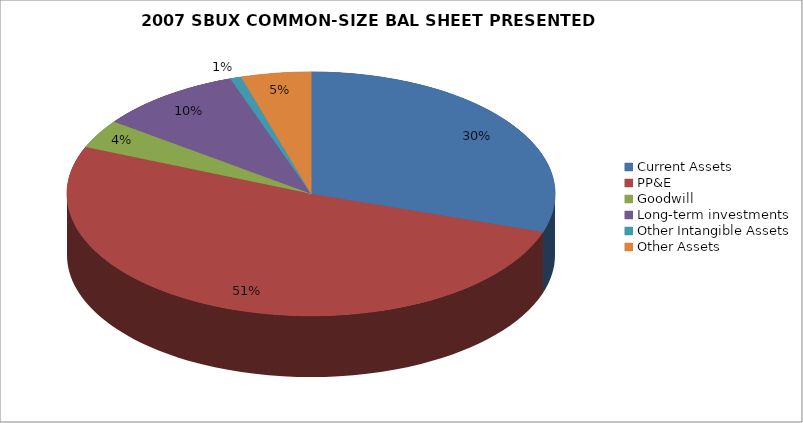
| Category | Current Assets PP&E Goodwill Long-term investments Other Intangible Assets Other Assets |
|---|---|
| Current Assets | 1696487 |
| PP&E | 2890433 |
| Goodwill | 215625 |
| Long-term investments | 538714 |
| Other Intangible Assets | 42043 |
| Other Assets | 261100 |